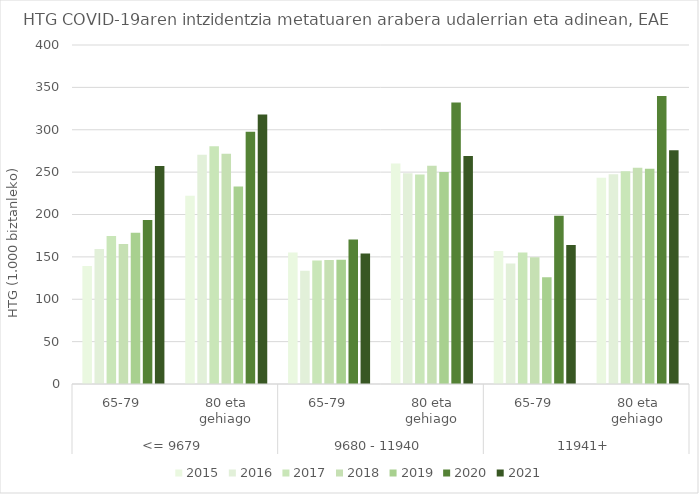
| Category | 2015 | 2016 | 2017 | 2018 | 2019 | 2020 | 2021 |
|---|---|---|---|---|---|---|---|
| 0 | 139.303 | 159.383 | 174.497 | 165.138 | 178.404 | 193.548 | 257.117 |
| 1 | 222.222 | 270.557 | 280.612 | 271.726 | 233.069 | 297.767 | 317.915 |
| 2 | 155.031 | 133.715 | 145.608 | 146.212 | 146.592 | 170.419 | 153.981 |
| 3 | 260.118 | 248.727 | 247.114 | 257.445 | 250.246 | 332.075 | 269.01 |
| 4 | 157.05 | 142.259 | 155.214 | 149.682 | 125.906 | 198.45 | 164.135 |
| 5 | 243.262 | 247.553 | 251.1 | 255.114 | 254.09 | 339.772 | 275.711 |